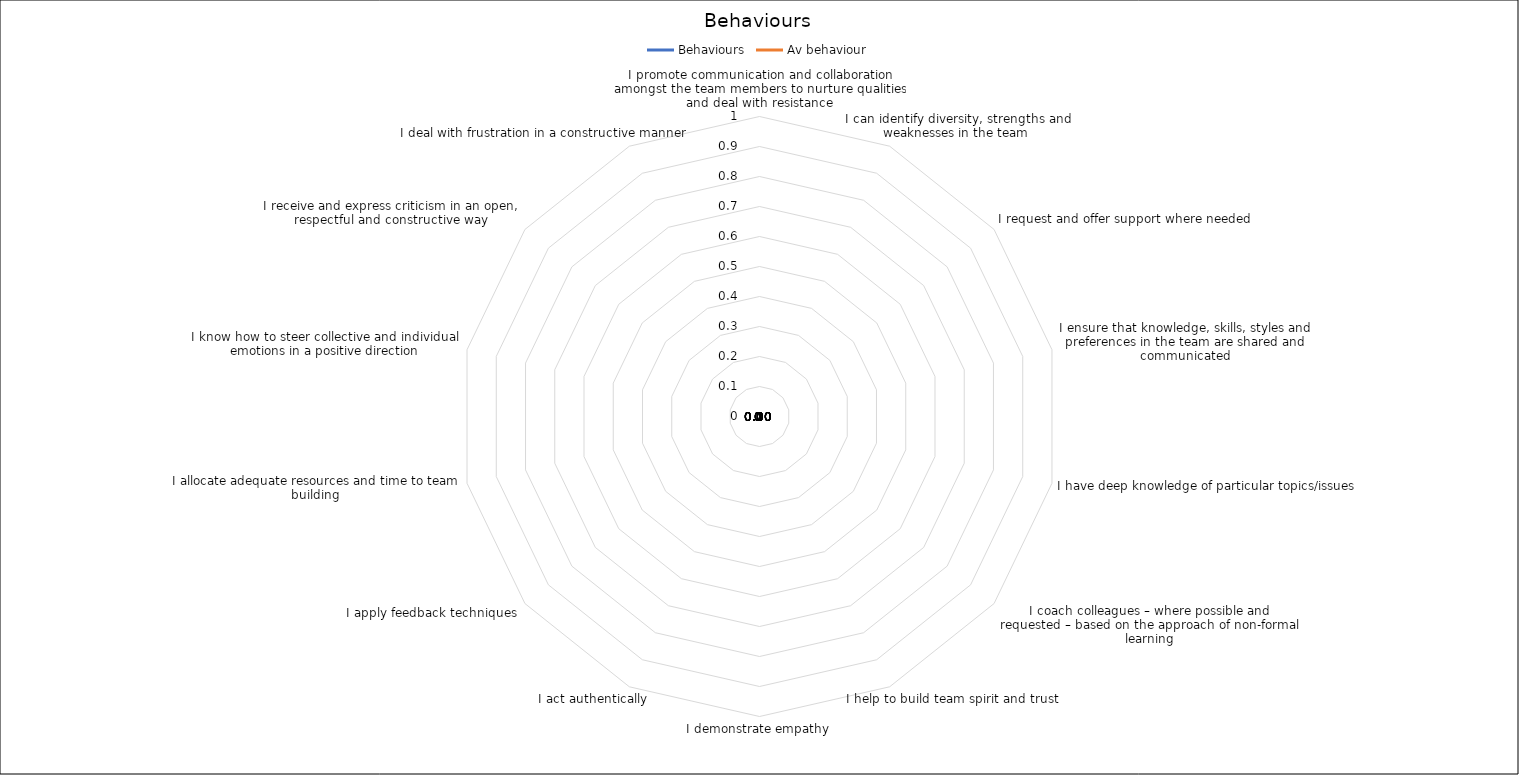
| Category | Behaviours | Av behaviour |
|---|---|---|
| I promote communication and collaboration amongst the team members to nurture qualities and deal with resistance | 0 | 0 |
| I can identify diversity, strengths and weaknesses in the team  | 0 | 0 |
| I request and offer support where needed | 0 | 0 |
| I ensure that knowledge, skills, styles and preferences in the team are shared and communicated | 0 | 0 |
| I have deep knowledge of particular topics/issues | 0 | 0 |
| I coach colleagues – where possible and requested – based on the approach of non-formal learning | 0 | 0 |
| I help to build team spirit and trust | 0 | 0 |
| I demonstrate empathy | 0 | 0 |
| I act authentically | 0 | 0 |
| I apply feedback techniques | 0 | 0 |
| I allocate adequate resources and time to team building | 0 | 0 |
| I know how to steer collective and individual emotions in a positive direction | 0 | 0 |
| I receive and express criticism in an open, respectful and constructive way | 0 | 0 |
| I deal with frustration in a constructive manner | 0 | 0 |